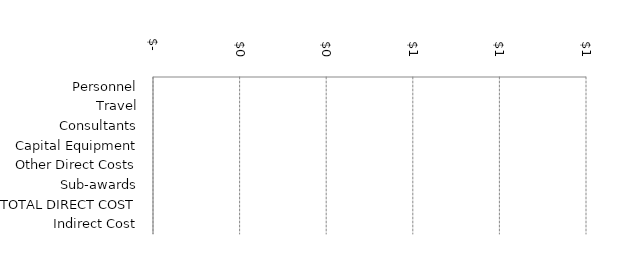
| Category | Series 1 |
|---|---|
| Personnel | 0 |
| Travel | 0 |
| Consultants | 0 |
| Capital Equipment | 0 |
| Other Direct Costs | 0 |
| Sub-awards | 0 |
| TOTAL DIRECT COST | 0 |
| Indirect Cost | 0 |